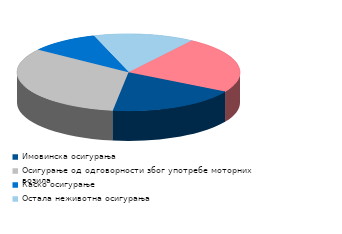
| Category | Series 0 |
|---|---|
| Имовинска осигурања | 18.9 |
| Осигурање од одговорности због употребе моторних возила | 32.8 |
| Каско осигурање | 9.9 |
| Остала неживотна осигурања | 14.6 |
| Животна осигурања | 23.8 |